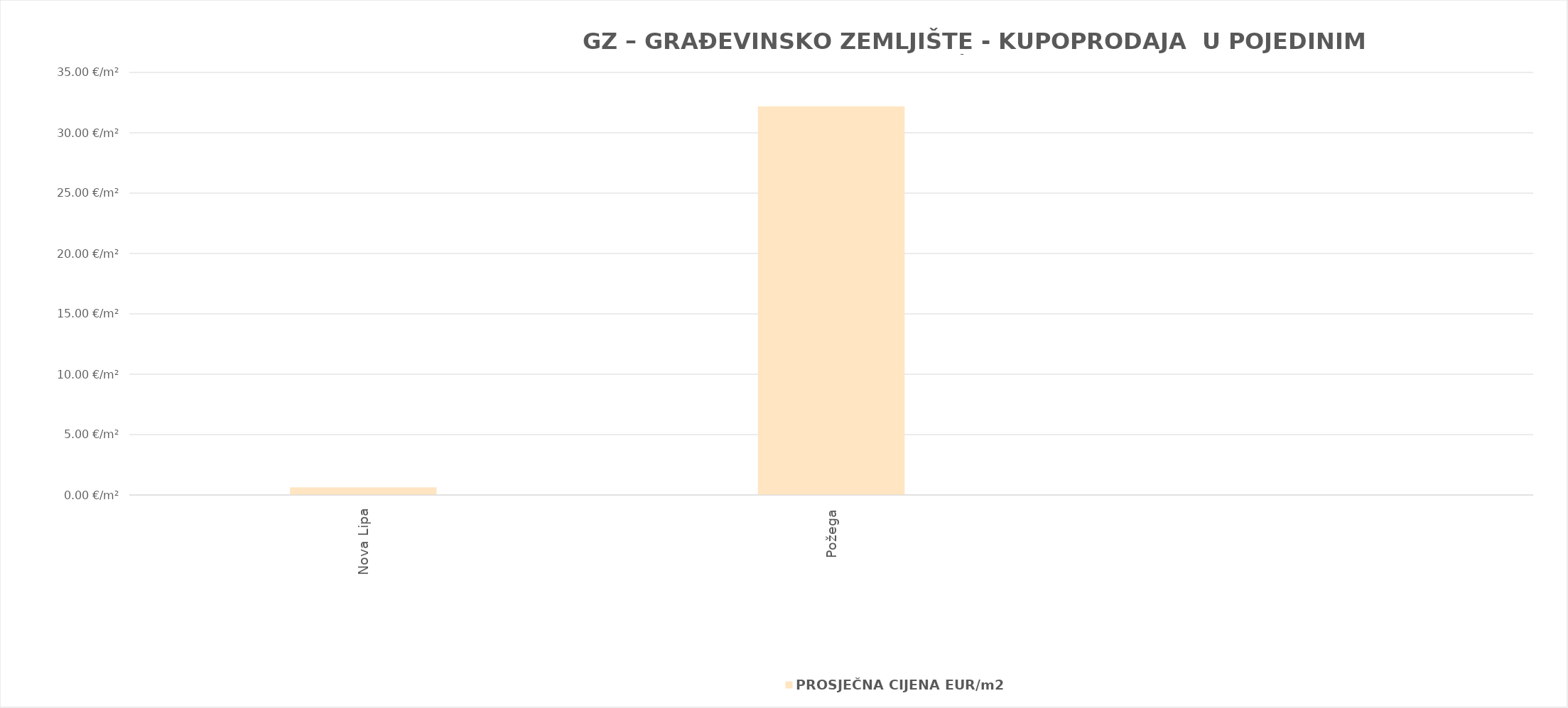
| Category | PROSJEČNA CIJENA EUR/m2 |
|---|---|
| Nova Lipa | 0.635 |
| Požega | 1900-02-01 04:27:12 |